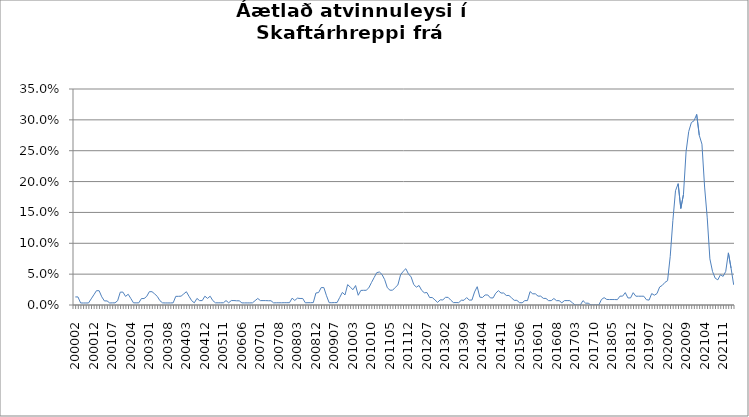
| Category | Series 0 |
|---|---|
| 200002 | 0.013 |
| 200003 | 0.013 |
| 200004 | 0.003 |
| 200005 | 0.003 |
| 200006 | 0.003 |
| 200007 | 0.003 |
| 200011 | 0.01 |
| 200012 | 0.017 |
| 200101 | 0.023 |
| 200102 | 0.023 |
| 200103 | 0.013 |
| 200104 | 0.007 |
| 200105 | 0.007 |
| 200106 | 0.003 |
| 200107 | 0.003 |
| 200108 | 0.003 |
| 200111 | 0.007 |
| 200112 | 0.021 |
| 200201 | 0.021 |
| 200202 | 0.014 |
| 200203 | 0.017 |
| 200204 | 0.01 |
| 200205 | 0.003 |
| 200206 | 0.003 |
| 200207 | 0.003 |
| 200210 | 0.01 |
| 200211 | 0.01 |
| 200212 | 0.014 |
| 200301 | 0.022 |
| 200302 | 0.022 |
| 200303 | 0.018 |
| 200304 | 0.014 |
| 200305 | 0.007 |
| 200306 | 0.003 |
| 200307 | 0.003 |
| 200308 | 0.003 |
| 200309 | 0.003 |
| 200310 | 0.004 |
| 200311 | 0.014 |
| 200312 | 0.014 |
| 200401 | 0.014 |
| 200402 | 0.018 |
| 200403 | 0.022 |
| 200404 | 0.014 |
| 200405 | 0.007 |
| 200406 | 0.004 |
| 200407 | 0.011 |
| 200408 | 0.007 |
| 200411 | 0.007 |
| 200412 | 0.014 |
| 200501 | 0.011 |
| 200502 | 0.014 |
| 200503 | 0.007 |
| 200504 | 0.004 |
| 200505 | 0.004 |
| 200510 | 0.004 |
| 200511 | 0.004 |
| 200512 | 0.007 |
| 200601 | 0.004 |
| 200602 | 0.007 |
| 200603 | 0.007 |
| 200604 | 0.007 |
| 200605 | 0.007 |
| 200606 | 0.003 |
| 200607 | 0.003 |
| 200608 | 0.003 |
| 200609 | 0.003 |
| 200610 | 0.004 |
| 200611 | 0.007 |
| 200612 | 0.011 |
| 200701 | 0.007 |
| 200702 | 0.007 |
| 200703 | 0.007 |
| 200704 | 0.007 |
| 200705 | 0.007 |
| 200706 | 0.003 |
| 200707 | 0.004 |
| 200708 | 0.004 |
| 200709 | 0.004 |
| 200710 | 0.004 |
| 200711 | 0.004 |
| 200712 | 0.004 |
| 200801 | 0.011 |
| 200802 | 0.007 |
| 200803 | 0.011 |
| 200804 | 0.011 |
| 200805 | 0.011 |
| 200806 | 0.004 |
| 200807 | 0.004 |
| 200808 | 0.004 |
| 200811 | 0.004 |
| 200812 | 0.019 |
| 200901 | 0.02 |
| 200902 | 0.028 |
| 200903 | 0.028 |
| 200904 | 0.015 |
| 200905 | 0.004 |
| 200906 | 0.004 |
| 200907 | 0.004 |
| 200908 | 0.004 |
| 200910 | 0.012 |
| 200911 | 0.02 |
| 200912 | 0.016 |
| 201001 | 0.033 |
| 201002 | 0.029 |
| 201003 | 0.025 |
| 201004 | 0.031 |
| 201005 | 0.016 |
| 201006 | 0.024 |
| 201007 | 0.024 |
| 201008 | 0.024 |
| 201009 | 0.028 |
| 201010 | 0.036 |
| 201011 | 0.044 |
| 201012 | 0.052 |
| 201101 | 0.053 |
| 201102 | 0.049 |
| 201103 | 0.041 |
| 201104 | 0.028 |
| 201105 | 0.024 |
| 201106 | 0.024 |
| 201107 | 0.028 |
| 201108 | 0.033 |
| 201109 | 0.049 |
| 201110 | 0.055 |
| 201111 | 0.059 |
| 201112 | 0.05 |
| 201201 | 0.045 |
| 201202 | 0.033 |
| 201203 | 0.029 |
| 201204 | 0.032 |
| 201205 | 0.024 |
| 201206 | 0.02 |
| 201207 | 0.02 |
| 201208 | 0.012 |
| 201209 | 0.012 |
| 201210 | 0.008 |
| 201211 | 0.004 |
| 201212 | 0.008 |
| 201301 | 0.008 |
| 201302 | 0.012 |
| 201303 | 0.012 |
| 201304 | 0.008 |
| 201305 | 0.004 |
| 201306 | 0.004 |
| 201307 | 0.004 |
| 201308 | 0.008 |
| 201309 | 0.008 |
| 201310 | 0.012 |
| 201311 | 0.008 |
| 201312 | 0.008 |
| 201401 | 0.021 |
| 201402 | 0.03 |
| 201403 | 0.013 |
| 201404 | 0.012 |
| 201405 | 0.016 |
| 201406 | 0.016 |
| 201407 | 0.011 |
| 201408 | 0.011 |
| 201409 | 0.019 |
| 201410 | 0.023 |
| 201411 | 0.019 |
| 201412 | 0.019 |
| 201501 | 0.015 |
| 201502 | 0.015 |
| 201503 | 0.012 |
| 201504 | 0.008 |
| 201505 | 0.008 |
| 201506 | 0.004 |
| 201507 | 0.004 |
| 201508 | 0.007 |
| 201509 | 0.007 |
| 201510 | 0.022 |
| 201511 | 0.018 |
| 201512 | 0.018 |
| 201601 | 0.014 |
| 201602 | 0.014 |
| 201603 | 0.011 |
| 201604 | 0.011 |
| 201605 | 0.007 |
| 201606 | 0.007 |
| 201607 | 0.011 |
| 201608 | 0.007 |
| 201609 | 0.007 |
| 201610 | 0.004 |
| 201611 | 0.007 |
| 201612 | 0.007 |
| 201701 | 0.007 |
| 201702 | 0.004 |
| 201703 | 0 |
| 201704 | 0 |
| 201705 | 0 |
| 201706 | 0.007 |
| 201707 | 0.003 |
| 201708 | 0.003 |
| 201709 | 0 |
| 201710 | 0 |
| 201711 | 0 |
| 201712 | 0 |
| 201801 | 0.009 |
| 201802 | 0.012 |
| 201803 | 0.009 |
| 201804 | 0.009 |
| 201805 | 0.009 |
| 201806 | 0.009 |
| 201807 | 0.009 |
| 201808 | 0.014 |
| 201809 | 0.014 |
| 201810 | 0.02 |
| 201811 | 0.011 |
| 201812 | 0.011 |
| 201901 | 0.02 |
| 201902 | 0.014 |
| 201903 | 0.014 |
| 201904 | 0.014 |
| 201905 | 0.014 |
| 201906 | 0.009 |
| 201907 | 0.008 |
| 201908 | 0.019 |
| 201909 | 0.016 |
| 201910 | 0.019 |
| 201911 | 0.029 |
| 201912 | 0.032 |
| 202001 | 0.037 |
| 202002 | 0.039 |
| 202003 | 0.079 |
| 202004 | 0.137 |
| 202005 | 0.185 |
| 202006 | 0.197 |
| 202007 | 0.156 |
| 202008 | 0.179 |
| 202009 | 0.249 |
| 202010 | 0.281 |
| 202011 | 0.296 |
| 202012 | 0.299 |
| 202101 | 0.309 |
| 202102 | 0.275 |
| 202103 | 0.261 |
| 202104 | 0.191 |
| 202105 | 0.141 |
| 202106 | 0.075 |
| 202107 | 0.054 |
| 202108 | 0.043 |
| 202109 | 0.041 |
| 202110 | 0.049 |
| 202111 | 0.046 |
| 202112 | 0.054 |
| 202201 | 0.084 |
| 202202 | 0.06 |
| 202203 | 0.033 |